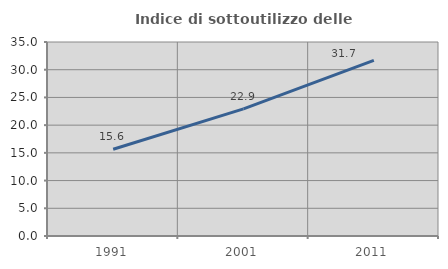
| Category | Indice di sottoutilizzo delle abitazioni  |
|---|---|
| 1991.0 | 15.647 |
| 2001.0 | 22.925 |
| 2011.0 | 31.669 |